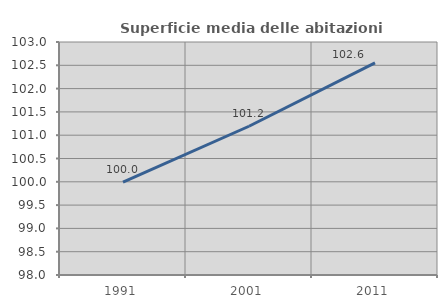
| Category | Superficie media delle abitazioni occupate |
|---|---|
| 1991.0 | 99.992 |
| 2001.0 | 101.192 |
| 2011.0 | 102.55 |